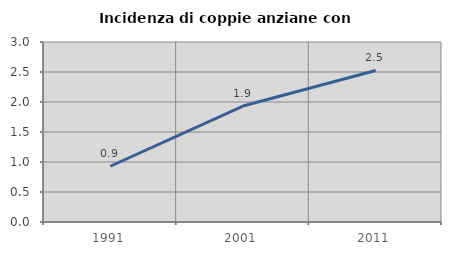
| Category | Incidenza di coppie anziane con figli |
|---|---|
| 1991.0 | 0.929 |
| 2001.0 | 1.933 |
| 2011.0 | 2.526 |